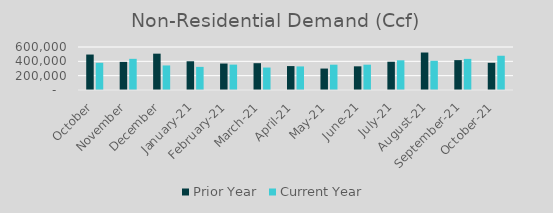
| Category | Prior Year | Current Year |
|---|---|---|
| October | 494775 | 379515 |
| November | 392357 | 434815 |
| December | 507022 | 342584.594 |
| January-21 | 400923.849 | 322657.16 |
| February-21 | 369131.684 | 354041 |
| March-21 | 374117 | 313343 |
| April-21 | 333800.488 | 329084.722 |
| May-21 | 299245.56 | 353085 |
| June-21 | 330441.187 | 353141.442 |
| July-21 | 394304.316 | 414577.112 |
| August-21 | 522963.473 | 407774.995 |
| September-21 | 416886.629 | 434192.442 |
| October-21 | 379515 | 477878.526 |